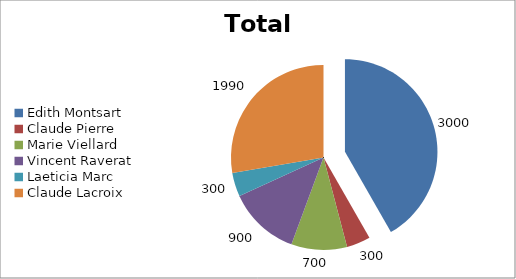
| Category | Total Dépenses |
|---|---|
| Edith Montsart | 3000 |
| Claude Pierre | 300 |
| Marie Viellard | 700 |
| Vincent Raverat | 900 |
| Laeticia Marc | 300 |
| Claude Lacroix | 1990 |